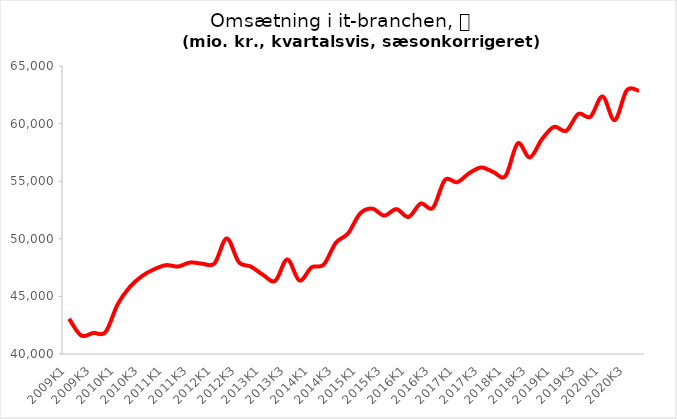
| Category | Series 0 |
|---|---|
| 2009K1 | 43058.7 |
| 2009K2 | 41601.6 |
| 2009K3 | 41828 |
| 2009K4 | 41892 |
| 2010K1 | 44297 |
| 2010K2 | 45807 |
| 2010K3 | 46755 |
| 2010K4 | 47349 |
| 2011K1 | 47714 |
| 2011K2 | 47595 |
| 2011K3 | 47949 |
| 2011K4 | 47833 |
| 2012K1 | 47870 |
| 2012K2 | 50032 |
| 2012K3 | 47975 |
| 2012K4 | 47584 |
| 2013K1 | 46870 |
| 2013K2 | 46349 |
| 2013K3 | 48205 |
| 2013K4 | 46377 |
| 2014K1 | 47524 |
| 2014K2 | 47757 |
| 2014K3 | 49653 |
| 2014K4 | 50455 |
| 2015K1 | 52192 |
| 2015K2 | 52619 |
| 2015K3 | 52017 |
| 2015K4 | 52577 |
| 2016K1 | 51890 |
| 2016K2 | 53058 |
| 2016K3 | 52670 |
| 2016K4 | 55112 |
| 2017K1 | 54912 |
| 2017K2 | 55695 |
| 2017K3 | 56189 |
| 2017K4 | 55791 |
| 2018K1 | 55456 |
| 2018K2 | 58279 |
| 2018K3 | 57058 |
| 2018K4 | 58643 |
| 2019K1 | 59716 |
| 2019K2 | 59372 |
| 2019K3 | 60837 |
| 2019K4 | 60596 |
| 2020K1 | 62357 |
| 2020K2 | 60300 |
| 2020K3 | 62900 |
| 2020K4 | 62847 |